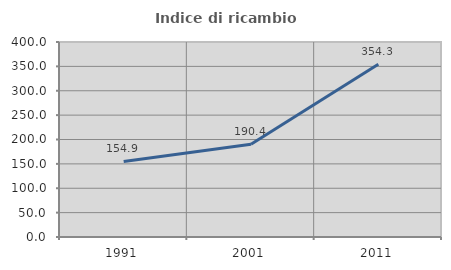
| Category | Indice di ricambio occupazionale  |
|---|---|
| 1991.0 | 154.938 |
| 2001.0 | 190.37 |
| 2011.0 | 354.286 |